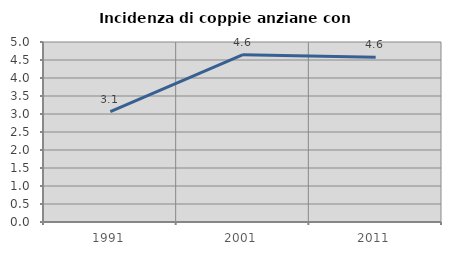
| Category | Incidenza di coppie anziane con figli |
|---|---|
| 1991.0 | 3.067 |
| 2001.0 | 4.648 |
| 2011.0 | 4.578 |